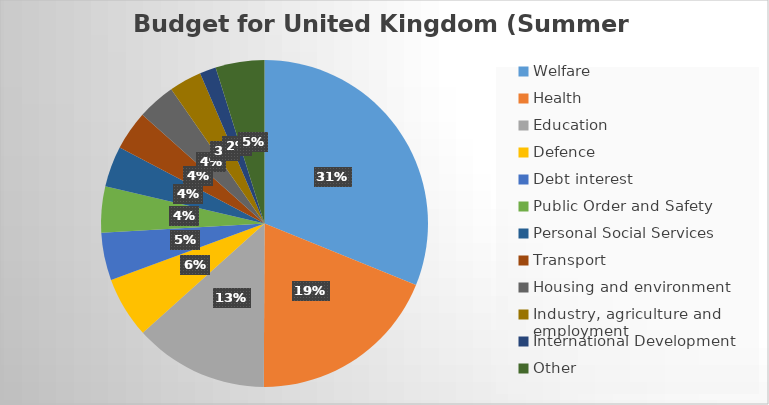
| Category | Series 0 |
|---|---|
| Welfare | 232 |
| Health | 141 |
| Education | 99 |
| Defence | 45 |
| Debt interest | 35 |
| Public Order and Safety | 34 |
| Personal Social Services | 30 |
| Transport | 29 |
| Housing and environment | 28 |
| Industry, agriculture and employment | 24 |
| International Development | 12 |
| Other | 36 |